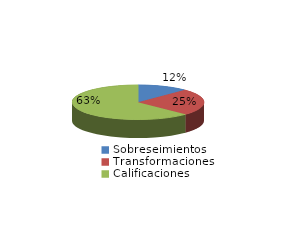
| Category | Series 0 |
|---|---|
| Sobreseimientos | 199 |
| Transformaciones | 401 |
| Calificaciones | 1009 |